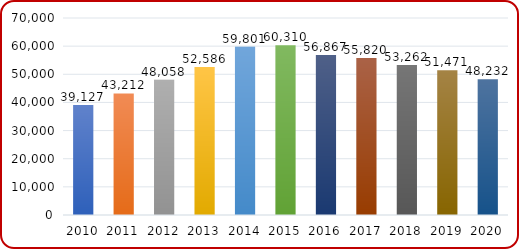
| Category | Total Enrolment |
|---|---|
| 2010 | 39127 |
| 2011 | 43212 |
| 2012 | 48058 |
| 2013 | 52586 |
| 2014 | 59801 |
| 2015 | 60310 |
| 2016 | 56867 |
| 2017 | 55820 |
| 2018 | 53262 |
| 2019 | 51471 |
| 2020 | 48232 |